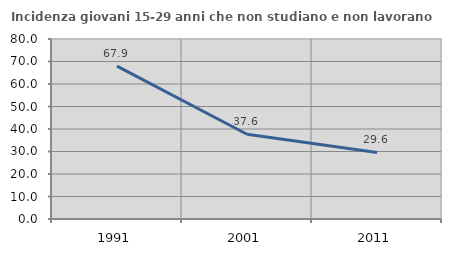
| Category | Incidenza giovani 15-29 anni che non studiano e non lavorano  |
|---|---|
| 1991.0 | 67.939 |
| 2001.0 | 37.647 |
| 2011.0 | 29.595 |